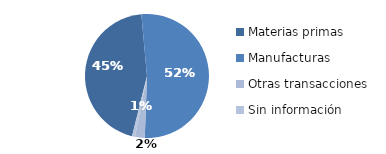
| Category | Series 0 |
|---|---|
| Materias primas | 1006.752 |
| Manufacturas | 1173.06 |
| Otras transacciones | 57.323 |
| Sin información | 17.344 |